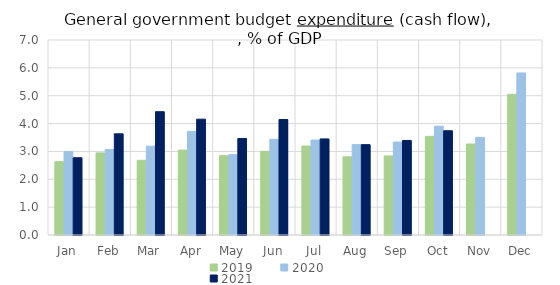
| Category | 2019 | 2020 | 2021 |
|---|---|---|---|
| Jan | 2.633 | 2.994 | 2.773 |
| Feb | 2.947 | 3.069 | 3.631 |
| Mar | 2.682 | 3.188 | 4.426 |
| Apr | 3.048 | 3.719 | 4.158 |
| May | 2.848 | 2.883 | 3.462 |
| Jun | 3.004 | 3.435 | 4.144 |
| Jul | 3.192 | 3.408 | 3.45 |
| Aug | 2.806 | 3.245 | 3.244 |
| Sep | 2.838 | 3.337 | 3.394 |
| Oct | 3.542 | 3.907 | 3.743 |
| Nov | 3.266 | 3.506 | 0 |
| Dec | 5.05 | 5.817 | 0 |